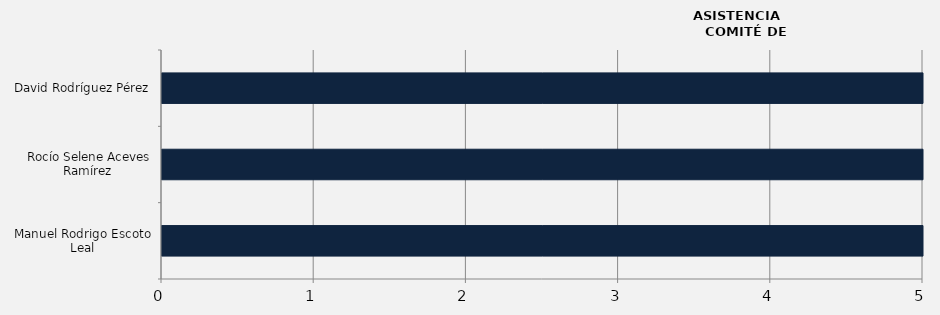
| Category | Series 0 |
|---|---|
| Manuel Rodrigo Escoto Leal | 5 |
| Rocío Selene Aceves Ramírez  | 5 |
| David Rodríguez Pérez | 5 |